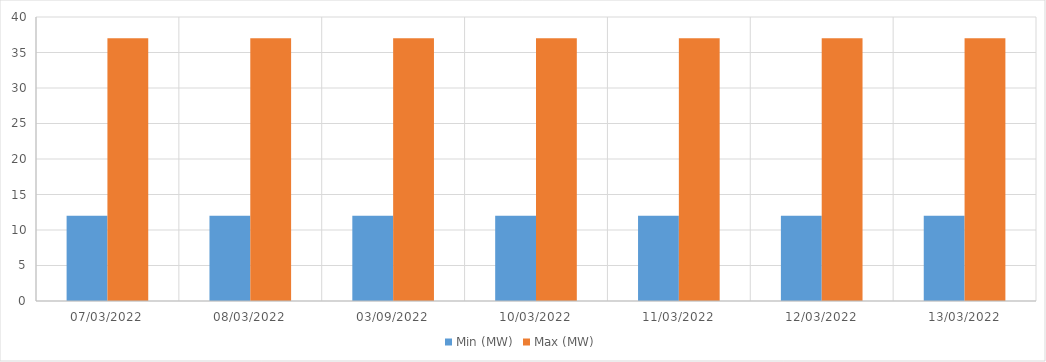
| Category | Min (MW) | Max (MW) |
|---|---|---|
| 07/03/2022 | 12 | 37 |
| 08/03/2022 | 12 | 37 |
| 03/09/2022 | 12 | 37 |
| 10/03/2022 | 12 | 37 |
| 11/03/2022 | 12 | 37 |
| 12/03/2022 | 12 | 37 |
| 13/03/2022 | 12 | 37 |